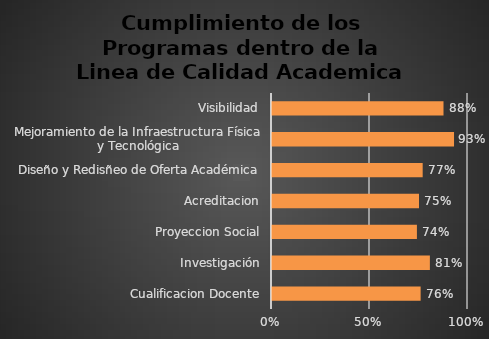
| Category | Series 0 |
|---|---|
| Cualificacion Docente | 0.758 |
| Investigación | 0.806 |
| Proyeccion Social | 0.739 |
| Acreditacion | 0.75 |
| Diseño y Redisñeo de Oferta Académica | 0.769 |
| Mejoramiento de la Infraestructura Física y Tecnológica | 0.929 |
| Visibilidad | 0.875 |